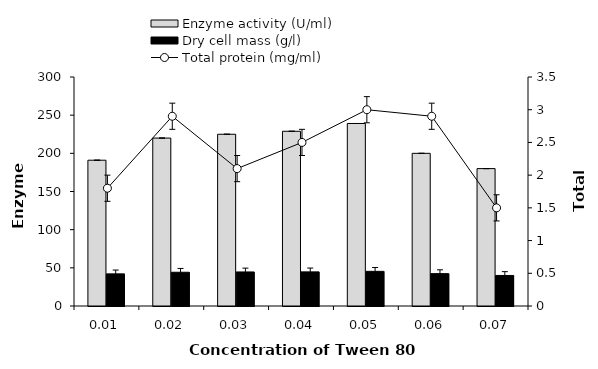
| Category | Enzyme activity (U/ml) | Dry cell mass (g/l) |
|---|---|---|
| 0.01 | 191 | 42.1 |
| 0.02 | 220 | 44.2 |
| 0.03 | 225 | 44.6 |
| 0.04 | 228.9 | 44.7 |
| 0.05 | 239.1 | 45.4 |
| 0.06 | 200 | 42.4 |
| 0.07 | 180 | 40 |